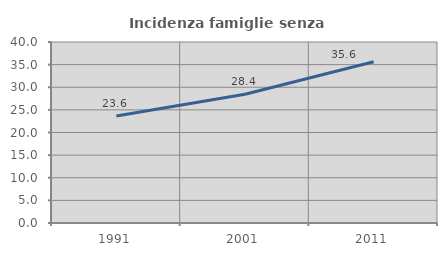
| Category | Incidenza famiglie senza nuclei |
|---|---|
| 1991.0 | 23.643 |
| 2001.0 | 28.441 |
| 2011.0 | 35.639 |